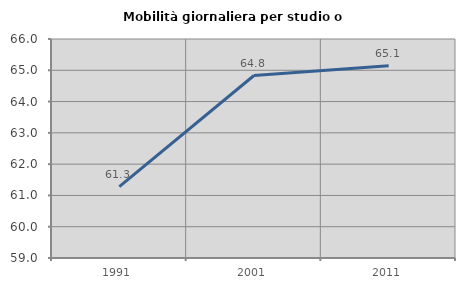
| Category | Mobilità giornaliera per studio o lavoro |
|---|---|
| 1991.0 | 61.279 |
| 2001.0 | 64.833 |
| 2011.0 | 65.143 |